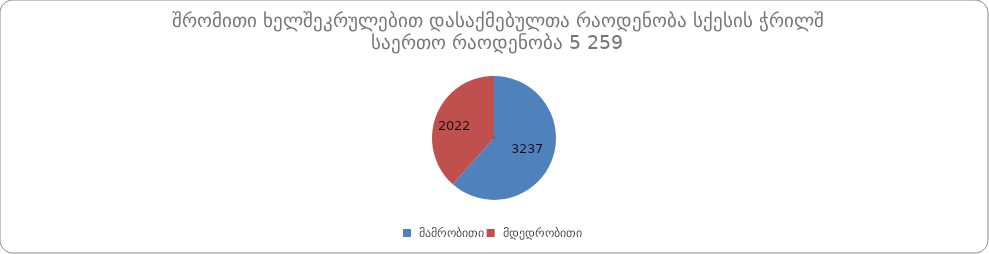
| Category | რაოდენობა |
|---|---|
|  მამრობითი | 3237 |
|  მდედრობითი | 2022 |